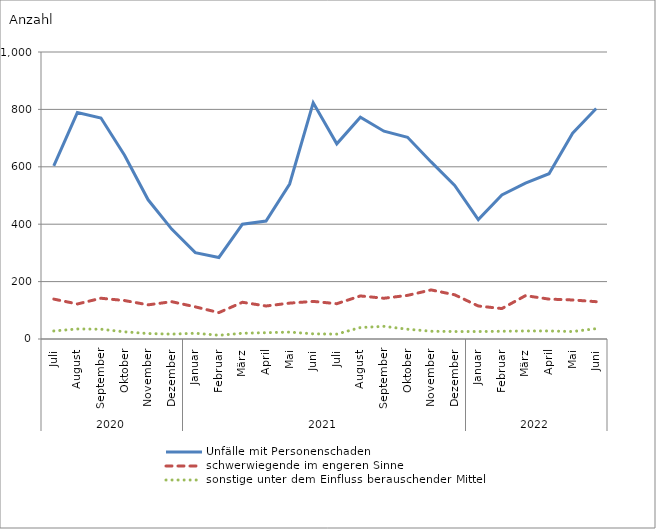
| Category | Unfälle mit Personenschaden | schwerwiegende im engeren Sinne | sonstige unter dem Einfluss berauschender Mittel |
|---|---|---|---|
| 0 | 603 | 139 | 28 |
| 1 | 789 | 122 | 35 |
| 2 | 770 | 142 | 34 |
| 3 | 640 | 134 | 25 |
| 4 | 485 | 119 | 19 |
| 5 | 383 | 130 | 17 |
| 6 | 301 | 112 | 20 |
| 7 | 284 | 92 | 13 |
| 8 | 400 | 128 | 20 |
| 9 | 411 | 115 | 22 |
| 10 | 540 | 125 | 24 |
| 11 | 823 | 131 | 18 |
| 12 | 680 | 123 | 17 |
| 13 | 773 | 150 | 40 |
| 14 | 724 | 142 | 44 |
| 15 | 703 | 152 | 34 |
| 16 | 617 | 171 | 27 |
| 17 | 535 | 154 | 26 |
| 18 | 416 | 115 | 26 |
| 19 | 502 | 106 | 27 |
| 20 | 543 | 151 | 28 |
| 21 | 576 | 139 | 28 |
| 22 | 717 | 136 | 26 |
| 23 | 803 | 130 | 36 |